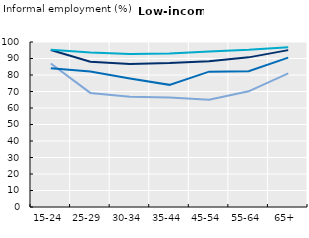
| Category | Total | Employees | Employers | Own-account workers |
|---|---|---|---|---|
| 15-24 | 95.116 | 86.998 | 84.064 | 95.263 |
| 25-29 | 88.074 | 69.136 | 82.096 | 93.698 |
| 30-34 | 86.727 | 66.795 | 77.91 | 92.676 |
| 35-44 | 87.258 | 66.318 | 74.028 | 93.1 |
| 45-54 | 88.327 | 65.069 | 82.015 | 94.312 |
| 55-64 | 90.687 | 70.129 | 82.302 | 95.254 |
| 65+ | 95.077 | 80.937 | 90.517 | 96.815 |